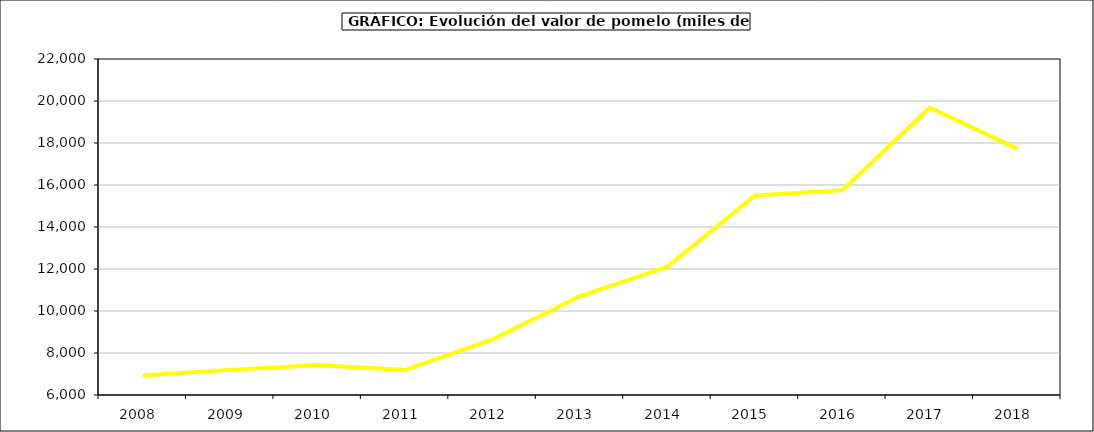
| Category | Valor |
|---|---|
| 2008.0 | 6934.237 |
| 2009.0 | 7196.478 |
| 2010.0 | 7430.969 |
| 2011.0 | 7186.419 |
| 2012.0 | 8649.711 |
| 2013.0 | 10707.894 |
| 2014.0 | 12111.902 |
| 2015.0 | 15505 |
| 2016.0 | 15755 |
| 2017.0 | 19680.125 |
| 2018.0 | 17733.461 |